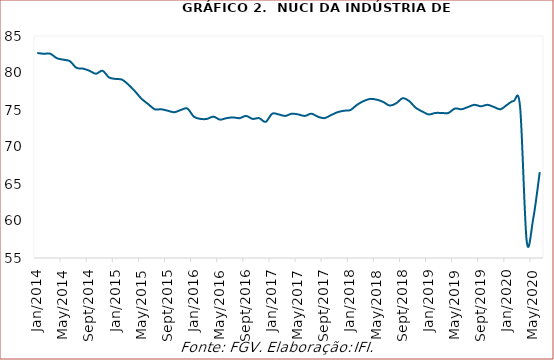
| Category | Nuci |
|---|---|
| 2014-01-01 | 82.7 |
| 2014-02-01 | 82.6 |
| 2014-03-01 | 82.6 |
| 2014-04-01 | 82 |
| 2014-05-01 | 81.8 |
| 2014-06-01 | 81.6 |
| 2014-07-01 | 80.7 |
| 2014-08-01 | 80.6 |
| 2014-09-01 | 80.3 |
| 2014-10-01 | 79.9 |
| 2014-11-01 | 80.3 |
| 2014-12-01 | 79.4 |
| 2015-01-01 | 79.2 |
| 2015-02-01 | 79.1 |
| 2015-03-01 | 78.4 |
| 2015-04-01 | 77.5 |
| 2015-05-01 | 76.5 |
| 2015-06-01 | 75.8 |
| 2015-07-01 | 75.1 |
| 2015-08-01 | 75.1 |
| 2015-09-01 | 74.9 |
| 2015-10-01 | 74.7 |
| 2015-11-01 | 75 |
| 2015-12-01 | 75.2 |
| 2016-01-01 | 74.1 |
| 2016-02-01 | 73.8 |
| 2016-03-01 | 73.8 |
| 2016-04-01 | 74.1 |
| 2016-05-01 | 73.7 |
| 2016-06-01 | 73.9 |
| 2016-07-01 | 74 |
| 2016-08-01 | 73.9 |
| 2016-09-01 | 74.2 |
| 2016-10-01 | 73.8 |
| 2016-11-01 | 73.9 |
| 2016-12-01 | 73.4 |
| 2017-01-01 | 74.5 |
| 2017-02-01 | 74.4 |
| 2017-03-01 | 74.2 |
| 2017-04-01 | 74.5 |
| 2017-05-01 | 74.4 |
| 2017-06-01 | 74.2 |
| 2017-07-01 | 74.5 |
| 2017-08-01 | 74.1 |
| 2017-09-01 | 73.9 |
| 2017-10-01 | 74.3 |
| 2017-11-01 | 74.7 |
| 2017-12-01 | 74.9 |
| 2018-01-01 | 75 |
| 2018-02-01 | 75.7 |
| 2018-03-01 | 76.2 |
| 2018-04-01 | 76.5 |
| 2018-05-01 | 76.4 |
| 2018-06-01 | 76.1 |
| 2018-07-01 | 75.6 |
| 2018-08-01 | 75.9 |
| 2018-09-01 | 76.6 |
| 2018-10-01 | 76.2 |
| 2018-11-01 | 75.3 |
| 2018-12-01 | 74.8 |
| 2019-01-01 | 74.4 |
| 2019-02-01 | 74.6 |
| 2019-03-01 | 74.6 |
| 2019-04-01 | 74.6 |
| 2019-05-01 | 75.2 |
| 2019-06-01 | 75.1 |
| 2019-07-01 | 75.4 |
| 2019-08-01 | 75.7 |
| 2019-09-01 | 75.5 |
| 2019-10-01 | 75.7 |
| 2019-11-01 | 75.4 |
| 2019-12-01 | 75.1 |
| 2020-01-01 | 75.7 |
| 2020-02-01 | 76.2 |
| 2020-03-01 | 75.3 |
| 2020-04-01 | 57.3 |
| 2020-05-01 | 60.3 |
| 2020-06-01 | 66.6 |